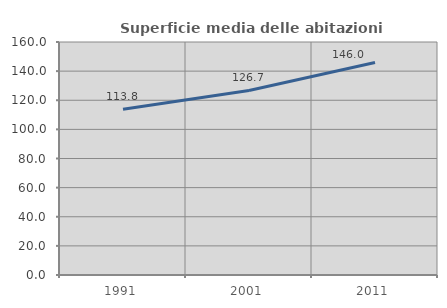
| Category | Superficie media delle abitazioni occupate |
|---|---|
| 1991.0 | 113.774 |
| 2001.0 | 126.725 |
| 2011.0 | 145.978 |